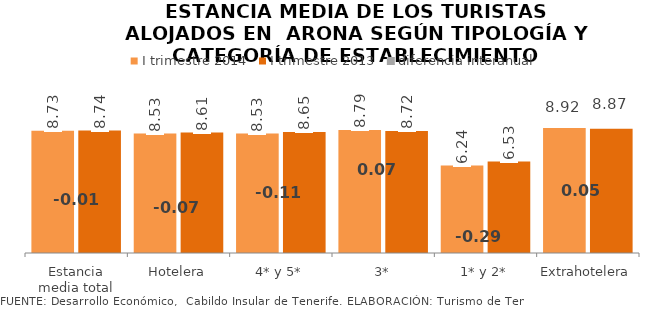
| Category | I trimestre 2014 | I trimestre 2013 |
|---|---|---|
| Estancia media total | 8.731 | 8.742 |
| Hotelera | 8.533 | 8.607 |
| 4* y 5* | 8.531 | 8.646 |
| 3* | 8.791 | 8.717 |
| 1* y 2* | 6.243 | 6.533 |
| Extrahotelera | 8.922 | 8.868 |